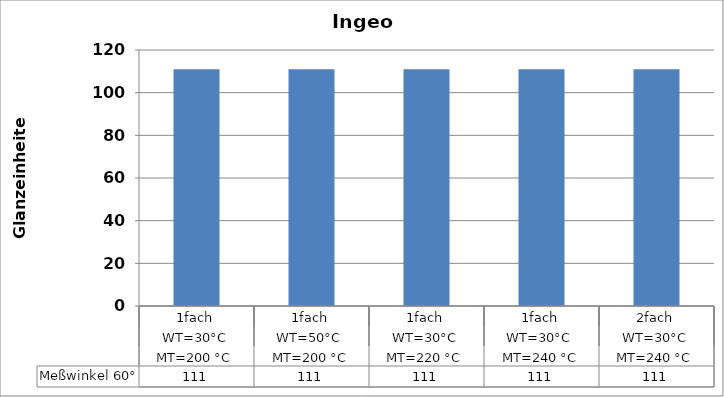
| Category | Meßwinkel 60° |
|---|---|
| 0 | 111 |
| 1 | 111 |
| 2 | 111 |
| 3 | 111 |
| 4 | 111 |